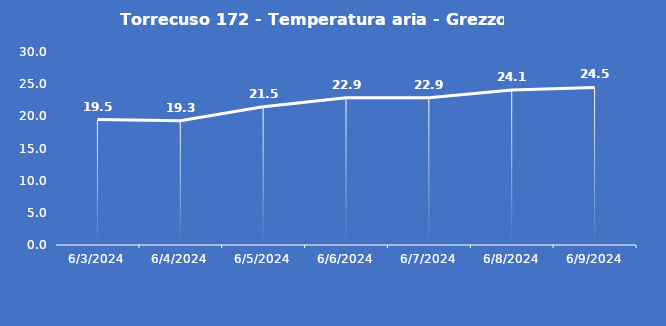
| Category | Torrecuso 172 - Temperatura aria - Grezzo (°C) |
|---|---|
| 6/3/24 | 19.5 |
| 6/4/24 | 19.3 |
| 6/5/24 | 21.5 |
| 6/6/24 | 22.9 |
| 6/7/24 | 22.9 |
| 6/8/24 | 24.1 |
| 6/9/24 | 24.5 |